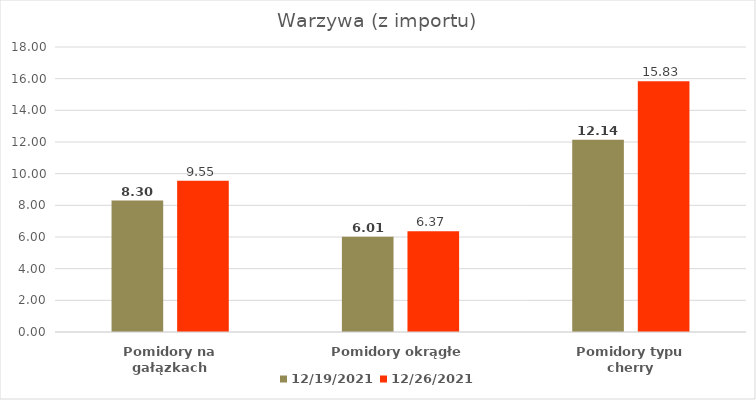
| Category | 2021-12-19 | 2021-12-26 |
|---|---|---|
| Pomidory na gałązkach | 8.3 | 9.55 |
| Pomidory okrągłe | 6.01 | 6.37 |
| Pomidory typu cherry | 12.14 | 15.83 |